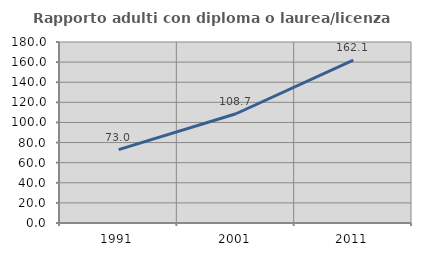
| Category | Rapporto adulti con diploma o laurea/licenza media  |
|---|---|
| 1991.0 | 72.982 |
| 2001.0 | 108.65 |
| 2011.0 | 162.08 |